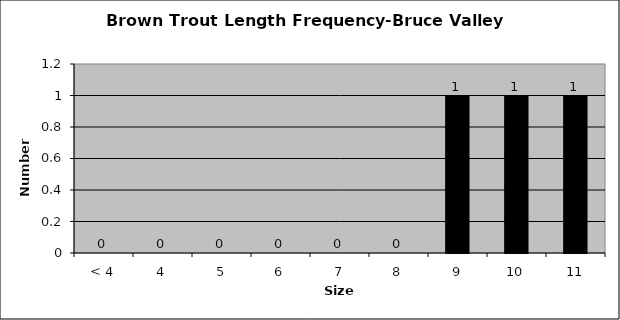
| Category | Series 0 |
|---|---|
| < 4 | 0 |
| 4 | 0 |
| 5 | 0 |
| 6 | 0 |
| 7 | 0 |
| 8 | 0 |
| 9 | 1 |
| 10 | 1 |
| 11 | 1 |